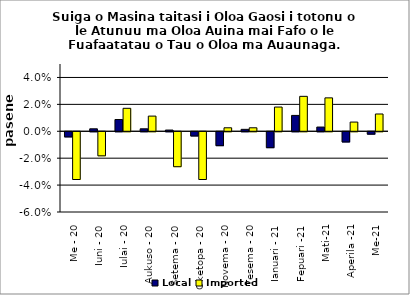
| Category | Local | Imported |
|---|---|---|
| Me - 20 | -0.004 | -0.035 |
| Iuni - 20 | 0.002 | -0.018 |
| Iulai - 20 | 0.009 | 0.017 |
| Aukuso - 20 | 0.002 | 0.011 |
| Setema - 20 | 0.001 | -0.026 |
| Oketopa - 20 | -0.003 | -0.035 |
| Novema - 20 | -0.01 | 0.003 |
| Tesema - 20 | 0.001 | 0.003 |
| Ianuari - 21 | -0.012 | 0.018 |
| Fepuari -21 | 0.012 | 0.026 |
| Mati-21 | 0.003 | 0.025 |
| Aperila -21 | -0.008 | 0.007 |
| Me-21 | -0.002 | 0.013 |